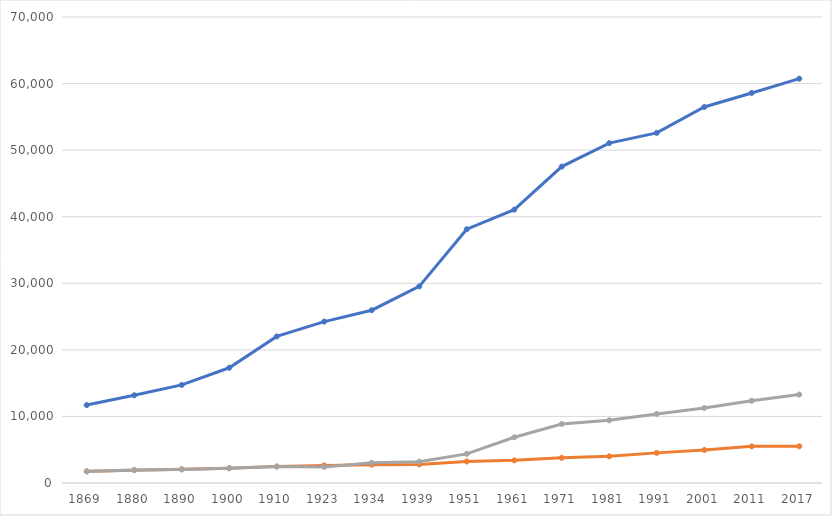
| Category | Entwicklung | Thalheim bei Wels | Marchtrenk |
|---|---|---|---|
| 1869.0 | 11704 | 1761 | 1727 |
| 1880.0 | 13175 | 1930 | 1942 |
| 1890.0 | 14735 | 2077 | 2025 |
| 1900.0 | 17308 | 2212 | 2219 |
| 1910.0 | 22015 | 2480 | 2467 |
| 1923.0 | 24248 | 2645 | 2416 |
| 1934.0 | 25956 | 2759 | 3035 |
| 1939.0 | 29533 | 2791 | 3207 |
| 1951.0 | 38120 | 3236 | 4377 |
| 1961.0 | 41060 | 3400 | 6869 |
| 1971.0 | 47527 | 3781 | 8873 |
| 1981.0 | 51060 | 4006 | 9416 |
| 1991.0 | 52594 | 4525 | 10369 |
| 2001.0 | 56478 | 4958 | 11274 |
| 2011.0 | 58591 | 5504 | 12359 |
| 2017.0 | 60739 | 5516 | 13284 |